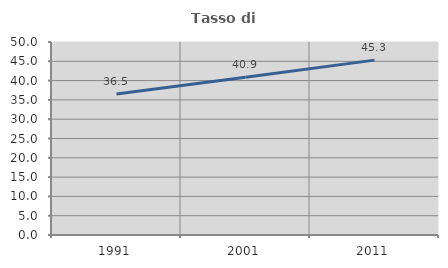
| Category | Tasso di occupazione   |
|---|---|
| 1991.0 | 36.526 |
| 2001.0 | 40.892 |
| 2011.0 | 45.307 |